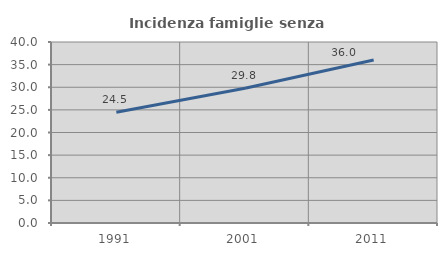
| Category | Incidenza famiglie senza nuclei |
|---|---|
| 1991.0 | 24.478 |
| 2001.0 | 29.775 |
| 2011.0 | 36.023 |